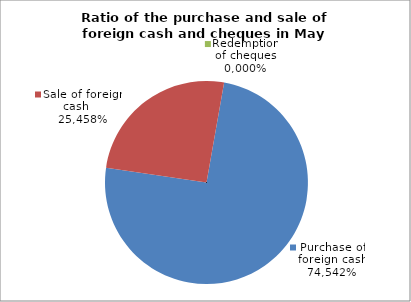
| Category | Purchase of foreign cash |
|---|---|
| 0 | 0.745 |
| 1 | 0.255 |
| 2 | 0 |